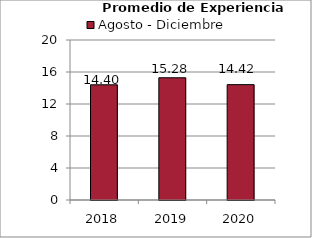
| Category | Agosto - Diciembre |
|---|---|
| 2018.0 | 14.4 |
| 2019.0 | 15.28 |
| 2020.0 | 14.42 |